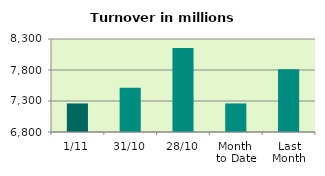
| Category | Series 0 |
|---|---|
| 1/11 | 7260.547 |
| 31/10 | 7511.726 |
| 28/10 | 8156.812 |
| Month 
to Date | 7260.547 |
| Last
Month | 7813.06 |